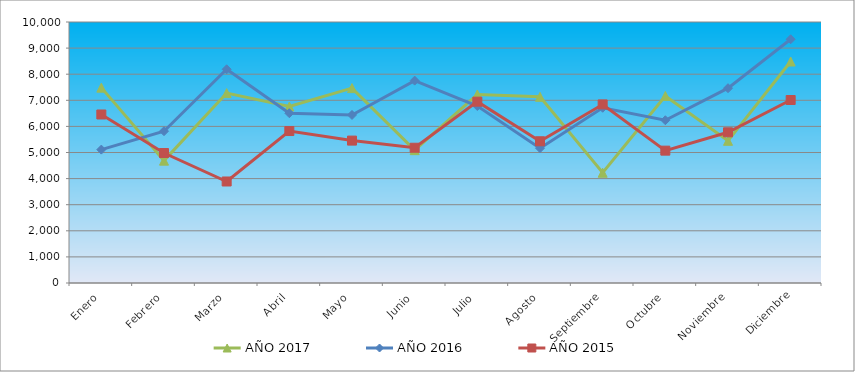
| Category | AÑO 2017 | AÑO 2016 | AÑO 2015 |
|---|---|---|---|
| Enero | 7485 | 5111 | 6456 |
| Febrero | 4688 | 5816 | 4980 |
| Marzo | 7276 | 8188 | 3889 |
| Abril | 6763 | 6506 | 5822 |
| Mayo | 7467 | 6439 | 5456 |
| Junio | 5090 | 7754 | 5182 |
| Julio | 7224 | 6780 | 6948 |
| Agosto | 7134 | 5166 | 5430 |
| Septiembre | 4224 | 6715 | 6842 |
| Octubre | 7166 | 6236 | 5071 |
| Noviembre | 5448 | 7464 | 5774 |
| Diciembre | 8486 | 9339 | 7011 |